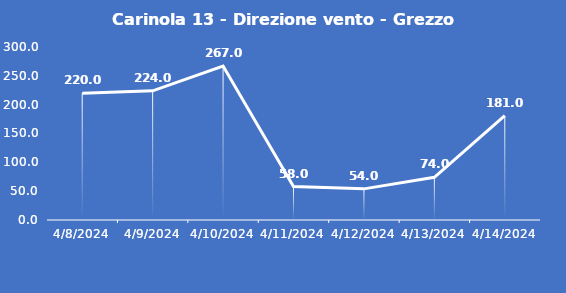
| Category | Carinola 13 - Direzione vento - Grezzo (°N) |
|---|---|
| 4/8/24 | 220 |
| 4/9/24 | 224 |
| 4/10/24 | 267 |
| 4/11/24 | 58 |
| 4/12/24 | 54 |
| 4/13/24 | 74 |
| 4/14/24 | 181 |